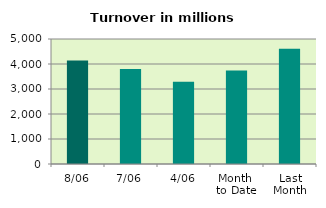
| Category | Series 0 |
|---|---|
| 8/06 | 4141.746 |
| 7/06 | 3802.406 |
| 4/06 | 3287.768 |
| Month 
to Date | 3738.459 |
| Last
Month | 4609.327 |